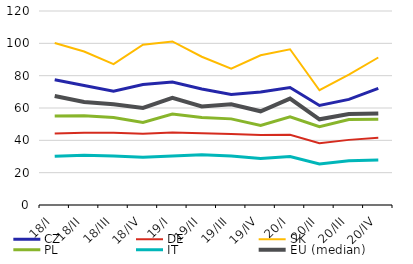
| Category | CZ | DE | SK | PL | IT | EU (median) |
|---|---|---|---|---|---|---|
| 18/I | 77.421 | 44.174 | 100.175 | 54.991 | 30.092 | 67.472 |
| 18/II | 73.871 | 44.615 | 94.924 | 55.133 | 30.779 | 63.757 |
| 18/III | 70.401 | 44.629 | 87.178 | 54.143 | 30.275 | 62.274 |
| 18/IV | 74.553 | 44.094 | 99.157 | 51.011 | 29.54 | 60.08 |
| 19/I | 76.041 | 44.771 | 101.148 | 56.275 | 30.264 | 66.345 |
| 19/II | 71.758 | 44.425 | 91.704 | 54.159 | 31.043 | 60.993 |
| 19/III | 68.321 | 43.952 | 84.261 | 53.278 | 30.31 | 62.252 |
| 19/IV | 69.961 | 43.352 | 92.6 | 49.177 | 28.757 | 57.963 |
| 20/I | 72.715 | 43.48 | 96.327 | 54.55 | 29.927 | 65.809 |
| 20/II | 61.55 | 38.263 | 70.98 | 48.474 | 25.343 | 53.023 |
| 20/III | 65.338 | 40.284 | 80.584 | 52.886 | 27.325 | 56.233 |
| 20/IV | 72.187 | 41.578 | 91.234 | 53.022 | 27.798 | 56.672 |